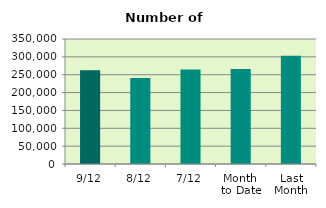
| Category | Series 0 |
|---|---|
| 9/12 | 262426 |
| 8/12 | 241058 |
| 7/12 | 264324 |
| Month 
to Date | 265819.429 |
| Last
Month | 303258.727 |